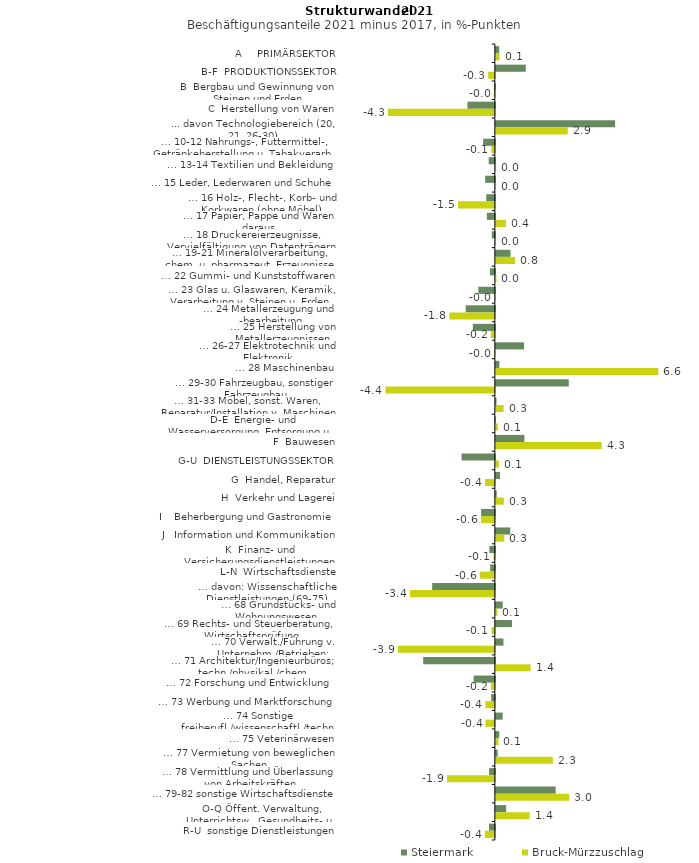
| Category | Steiermark | Bruck-Mürzzuschlag |
|---|---|---|
| A     PRIMÄRSEKTOR | 0.135 | 0.15 |
| B-F  PRODUKTIONSSEKTOR | 1.215 | -0.272 |
| B  Bergbau und Gewinnung von Steinen und Erden | -0.029 | -0.041 |
| C  Herstellung von Waren | -1.114 | -4.341 |
| ... davon Technologiebereich (20, 21, 26-30) | 4.84 | 2.916 |
| … 10-12 Nahrungs-, Futtermittel-, Getränkeherstellung u. Tabakverarb. | -0.477 | -0.143 |
| … 13-14 Textilien und Bekleidung | -0.249 | 0.009 |
| … 15 Leder, Lederwaren und Schuhe | -0.393 | 0 |
| … 16 Holz-, Flecht-, Korb- und Korkwaren (ohne Möbel)  | -0.35 | -1.494 |
| … 17 Papier, Pappe und Waren daraus  | -0.325 | 0.409 |
| … 18 Druckereierzeugnisse, Vervielfältigung von Datenträgern | -0.124 | 0.004 |
| … 19-21 Mineralölverarbeitung, chem. u. pharmazeut. Erzeugnisse | 0.594 | 0.783 |
| … 22 Gummi- und Kunststoffwaren | -0.198 | 0.022 |
| … 23 Glas u. Glaswaren, Keramik, Verarbeitung v. Steinen u. Erden  | -0.671 | -0.009 |
| … 24 Metallerzeugung und -bearbeitung | -1.183 | -1.846 |
| … 25 Herstellung von Metallerzeugnissen  | -0.894 | -0.168 |
| … 26-27 Elektrotechnik und Elektronik | 1.144 | -0.018 |
| … 28 Maschinenbau | 0.141 | 6.59 |
| … 29-30 Fahrzeugbau, sonstiger Fahrzeugbau | 2.959 | -4.439 |
| … 31-33 Möbel, sonst. Waren, Reparatur/Installation v. Maschinen | 0.026 | 0.315 |
| D-E  Energie- und Wasserversorgung, Entsorgung u. Rückgewinnung | -0.016 | 0.083 |
| F  Bauwesen | 1.158 | 4.298 |
| G-U  DIENSTLEISTUNGSSEKTOR | -1.351 | 0.122 |
| G  Handel, Reparatur | 0.17 | -0.398 |
| H  Verkehr und Lagerei | 0.036 | 0.324 |
| I    Beherbergung und Gastronomie | -0.556 | -0.565 |
| J   Information und Kommunikation | 0.584 | 0.343 |
| K  Finanz- und Versicherungsdienstleistungen | -0.224 | -0.055 |
| L-N  Wirtschaftsdienste | -0.191 | -0.609 |
| … davon: Wissenschaftliche Dienstleistungen (69-75) | -2.544 | -3.445 |
| … 68 Grundstücks- und Wohnungswesen  | 0.278 | 0.067 |
| … 69 Rechts- und Steuerberatung, Wirtschaftsprüfung | 0.654 | -0.137 |
| … 70 Verwalt./Führung v. Unternehm./Betrieben; Unternehmensberat. | 0.309 | -3.933 |
| … 71 Architektur/Ingenieurbüros; techn./physikal./chem. Untersuchung | -2.908 | 1.407 |
| … 72 Forschung und Entwicklung  | -0.862 | -0.16 |
| … 73 Werbung und Marktforschung | -0.151 | -0.381 |
| … 74 Sonstige freiberufl./wissenschaftl./techn. Tätigkeiten | 0.275 | -0.379 |
| … 75 Veterinärwesen | 0.139 | 0.105 |
| … 77 Vermietung von beweglichen Sachen  | 0.075 | 2.312 |
| … 78 Vermittlung und Überlassung von Arbeitskräften | -0.233 | -1.94 |
| … 79-82 sonstige Wirtschaftsdienste | 2.426 | 2.975 |
| O-Q Öffent. Verwaltung, Unterrichtsw., Gesundheits- u. Sozialwesen | 0.419 | 1.371 |
| R-U  sonstige Dienstleistungen | -0.238 | -0.407 |